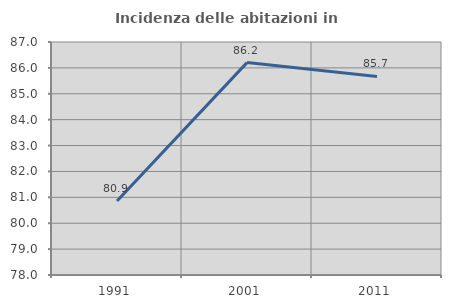
| Category | Incidenza delle abitazioni in proprietà  |
|---|---|
| 1991.0 | 80.857 |
| 2001.0 | 86.204 |
| 2011.0 | 85.671 |